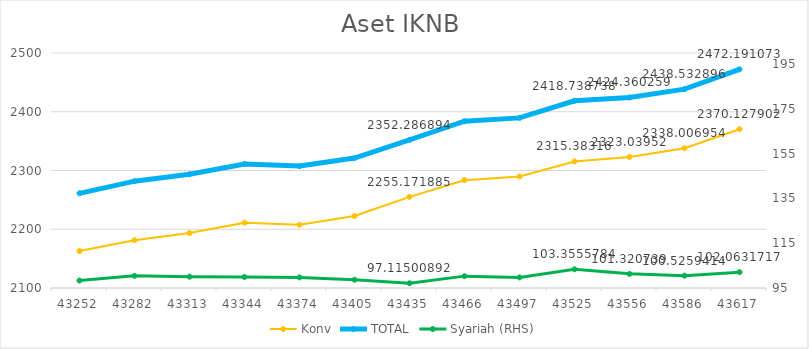
| Category | Konv | TOTAL |
|---|---|---|
| 43252.0 | 2162.818 | 2261.154 |
| 43282.0 | 2181.39 | 2281.837 |
| 43313.0 | 2193.55 | 2293.599 |
| 43344.0 | 2211.208 | 2311.146 |
| 43374.0 | 2207.768 | 2307.509 |
| 43405.0 | 2222.478 | 2321.18 |
| 43435.0 | 2255.172 | 2352.287 |
| 43466.0 | 2283.536 | 2383.836 |
| 43497.0 | 2289.807 | 2389.536 |
| 43525.0 | 2315.383 | 2418.739 |
| 43556.0 | 2323.04 | 2424.36 |
| 43586.0 | 2338.007 | 2438.533 |
| 43617.0 | 2370.128 | 2472.191 |